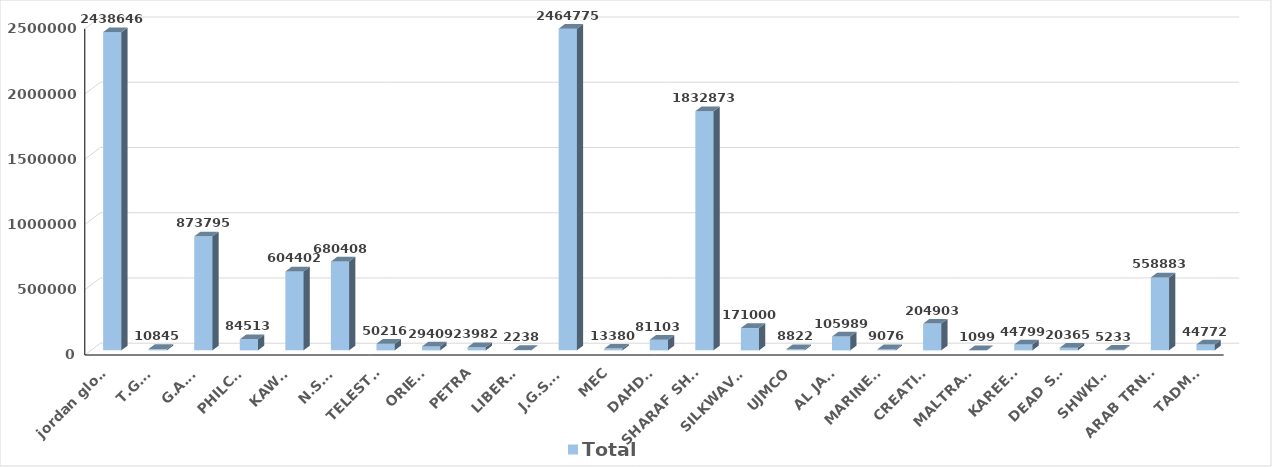
| Category | Total |
|---|---|
| jordan global | 2438646 |
| T.G.F. | 10845 |
| G.A.C. | 873795 |
| PHILCO | 84513 |
| KAWAR | 604402 |
| N.S.S. | 680408 |
| TELESTAR | 50216 |
| ORIENT | 29409 |
| PETRA | 23982 |
| LIBERTY | 2238 |
| J.G.S.A. | 2464775 |
| MEC | 13380 |
| DAHDAL | 81103 |
| SHARAF SHG. | 1832873 |
| SILKWAVES | 171000 |
| UJMCO | 8822 |
| AL JAZI | 105989 |
| MARINERS | 9076 |
| CREATIVE | 204903 |
| MALTRANS | 1099 |
| KAREEM | 44799 |
| DEAD SEA | 20365 |
| SHWKINI | 5233 |
| ARAB TRNSIT | 558883 |
| TADMOR | 44772 |